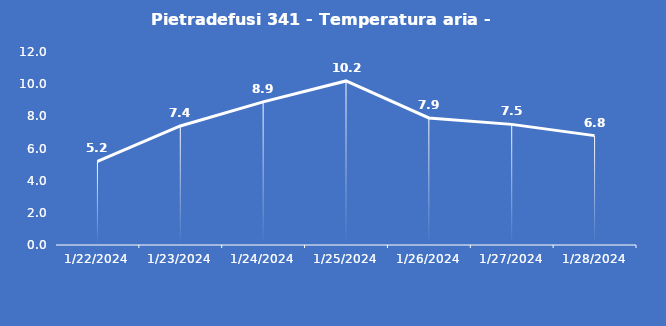
| Category | Pietradefusi 341 - Temperatura aria - Grezzo (°C) |
|---|---|
| 1/22/24 | 5.2 |
| 1/23/24 | 7.4 |
| 1/24/24 | 8.9 |
| 1/25/24 | 10.2 |
| 1/26/24 | 7.9 |
| 1/27/24 | 7.5 |
| 1/28/24 | 6.8 |